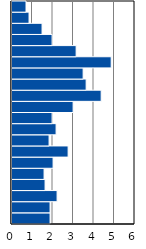
| Category | Series 0 |
|---|---|
| 0-4 | 1.857 |
| 5-9 | 1.857 |
| 10-14 | 2.199 |
| 15-19 | 1.613 |
| 20-24 | 1.564 |
| 25-29 | 2.004 |
| 30-34 | 2.737 |
| 35-39 | 1.808 |
| 40-44 | 2.151 |
| 45-49 | 1.955 |
| 50-54 | 2.981 |
| 55-59 | 4.35 |
| 60-64 | 3.617 |
| 65-69 | 3.47 |
| 70-74 | 4.839 |
| 75-79 | 3.128 |
| 80-84 | 1.955 |
| 85-89 | 1.466 |
| 90-94 | 0.831 |
| 95+ | 0.684 |